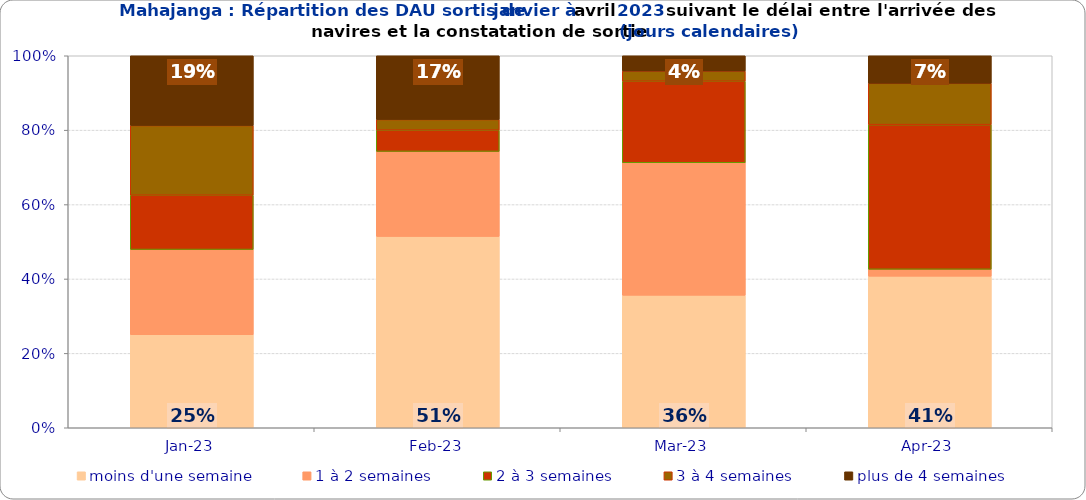
| Category | moins d'une semaine | 1 à 2 semaines | 2 à 3 semaines | 3 à 4 semaines | plus de 4 semaines |
|---|---|---|---|---|---|
| 2023-01-01 | 0.25 | 0.229 | 0.146 | 0.188 | 0.188 |
| 2023-02-01 | 0.514 | 0.229 | 0.057 | 0.029 | 0.171 |
| 2023-03-01 | 0.356 | 0.356 | 0.219 | 0.027 | 0.041 |
| 2023-04-01 | 0.407 | 0.019 | 0.389 | 0.111 | 0.074 |